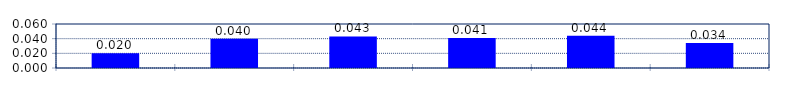
| Category | Series 0 |
|---|---|
| 0 | 0.02 |
| 1 | 0.04 |
| 2 | 0.043 |
| 3 | 0.041 |
| 4 | 0.044 |
| 5 | 0.034 |